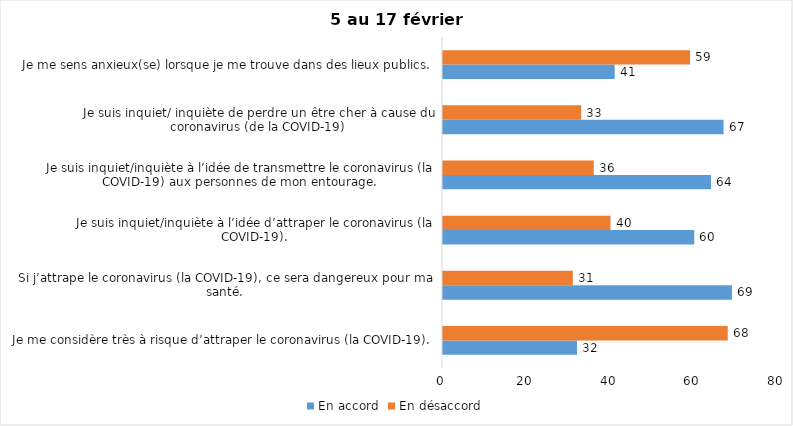
| Category | En accord | En désaccord |
|---|---|---|
| Je me considère très à risque d’attraper le coronavirus (la COVID-19). | 32 | 68 |
| Si j’attrape le coronavirus (la COVID-19), ce sera dangereux pour ma santé. | 69 | 31 |
| Je suis inquiet/inquiète à l’idée d’attraper le coronavirus (la COVID-19). | 60 | 40 |
| Je suis inquiet/inquiète à l’idée de transmettre le coronavirus (la COVID-19) aux personnes de mon entourage. | 64 | 36 |
| Je suis inquiet/ inquiète de perdre un être cher à cause du coronavirus (de la COVID-19) | 67 | 33 |
| Je me sens anxieux(se) lorsque je me trouve dans des lieux publics. | 41 | 59 |